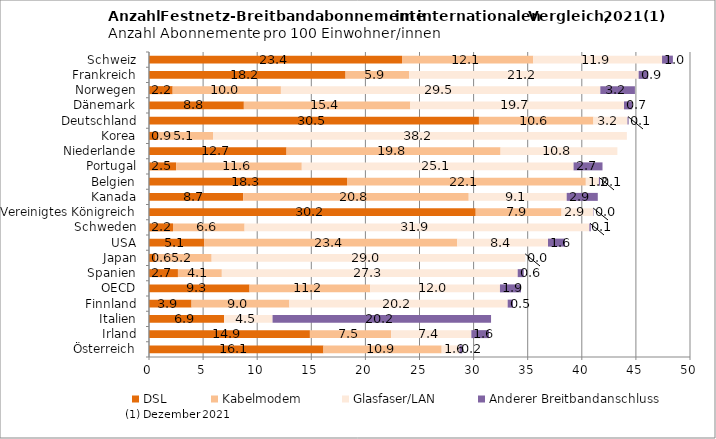
| Category | DSL  | Kabelmodem | Glasfaser/LAN | Anderer Breitbandanschluss  |
|---|---|---|---|---|
| Österreich | 16.124 | 10.925 | 1.647 | 0.249 |
| Irland | 14.871 | 7.511 | 7.411 | 1.63 |
| Italien | 6.932 | 0 | 4.488 | 20.193 |
| Finnland | 3.934 | 9.041 | 20.175 | 0.487 |
| OECD | 9.292 | 11.153 | 11.991 | 1.946 |
| Spanien | 2.675 | 4.056 | 27.345 | 0.56 |
| Japan | 0.595 | 5.195 | 28.978 | 0.003 |
| USA | 5.114 | 23.377 | 8.384 | 1.575 |
| Schweden | 2.218 | 6.617 | 31.864 | 0.131 |
| Vereinigtes Königreich | 30.196 | 7.93 | 2.912 | 0.038 |
| Kanada | 8.705 | 20.844 | 9.056 | 2.872 |
| Belgien | 18.3 | 22.073 | 1.207 | 0.111 |
| Portugal | 2.506 | 11.615 | 25.118 | 2.675 |
| Niederlande | 12.713 | 19.779 | 10.796 | 0 |
| Korea | 0.856 | 5.06 | 38.249 | 0 |
| Deutschland | 30.494 | 10.579 | 3.152 | 0.103 |
| Dänemark | 8.767 | 15.386 | 19.749 | 0.749 |
| Norwegen | 2.188 | 10.003 | 29.521 | 3.197 |
| Frankreich | 18.166 | 5.878 | 21.212 | 0.874 |
| Schweiz | 23.384 | 12.121 | 11.91 | 1.002 |